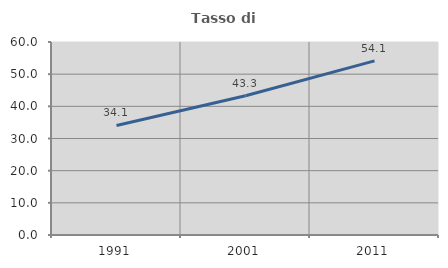
| Category | Tasso di occupazione   |
|---|---|
| 1991.0 | 34.066 |
| 2001.0 | 43.275 |
| 2011.0 | 54.118 |